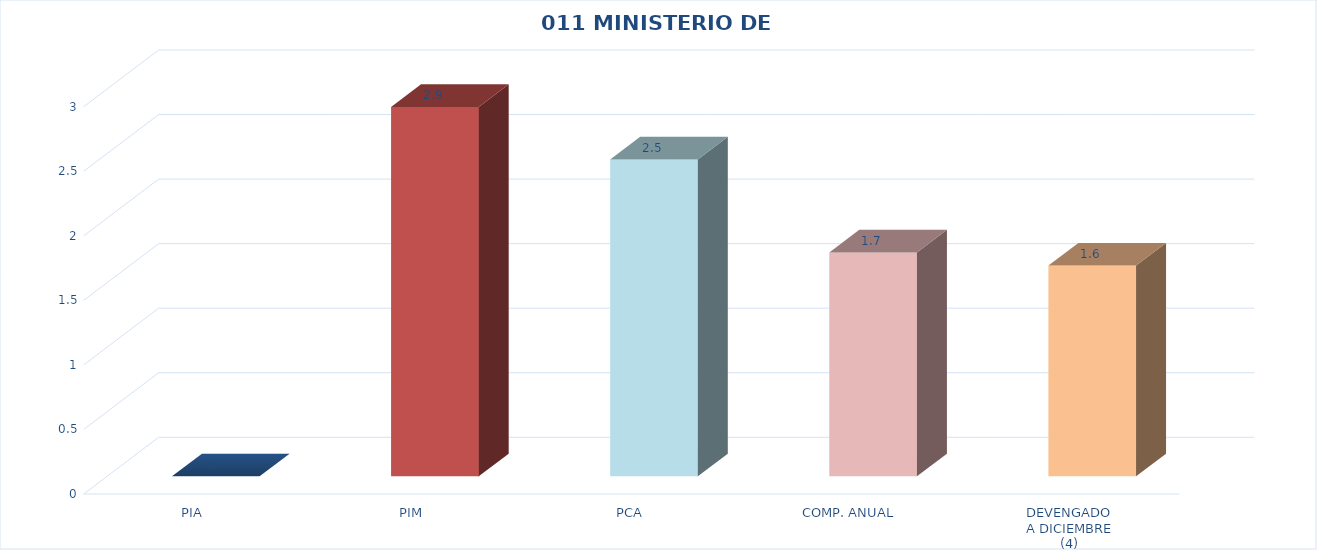
| Category | 011 MINISTERIO DE SALUD |
|---|---|
| PIA | 0 |
| PIM | 2.862 |
| PCA | 2.454 |
| COMP. ANUAL | 1.734 |
| DEVENGADO
A DICIEMBRE
(4) | 1.633 |